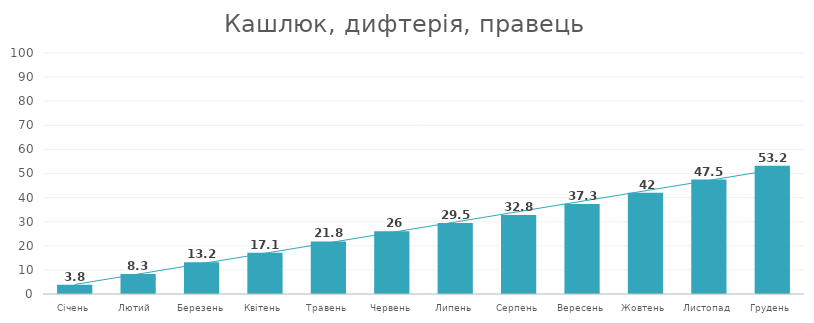
| Category | Кашлюк, дифтерія, правець. Діти до року |
|---|---|
| Січень | 3.8 |
| Лютий  | 8.3 |
| Березень | 13.2 |
| Квітень | 17.1 |
| Травень | 21.8 |
| Червень | 26 |
| Липень | 29.5 |
| Серпень | 32.8 |
| Вересень | 37.3 |
| Жовтень | 42 |
| Листопад | 47.5 |
| Грудень | 53.2 |